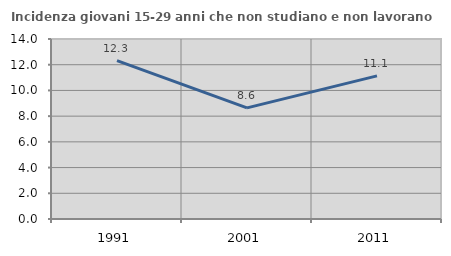
| Category | Incidenza giovani 15-29 anni che non studiano e non lavorano  |
|---|---|
| 1991.0 | 12.324 |
| 2001.0 | 8.643 |
| 2011.0 | 11.131 |